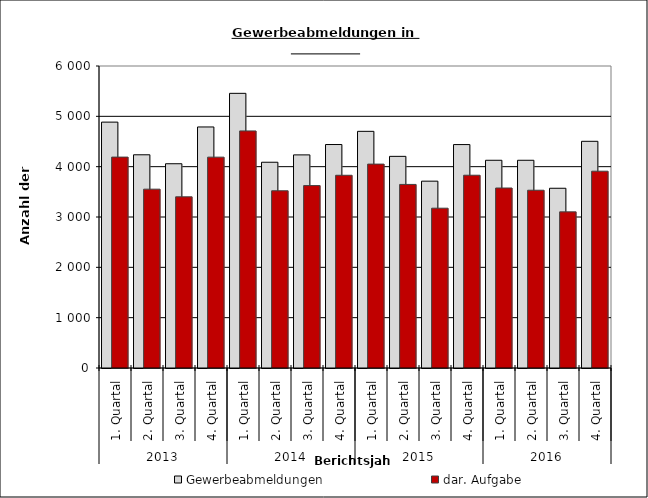
| Category | Gewerbeabmeldungen | dar. Aufgabe |
|---|---|---|
| 0 | 4885 | 4190 |
| 1 | 4236 | 3553 |
| 2 | 4058 | 3401 |
| 3 | 4789 | 4189 |
| 4 | 5457 | 4710 |
| 5 | 4088 | 3521 |
| 6 | 4234 | 3624 |
| 7 | 4440 | 3829 |
| 8 | 4702 | 4051 |
| 9 | 4205 | 3647 |
| 10 | 3712 | 3175 |
| 11 | 4439 | 3830 |
| 12 | 4127 | 3576 |
| 13 | 4127 | 3532 |
| 14 | 3571 | 3102 |
| 15 | 4504 | 3910 |